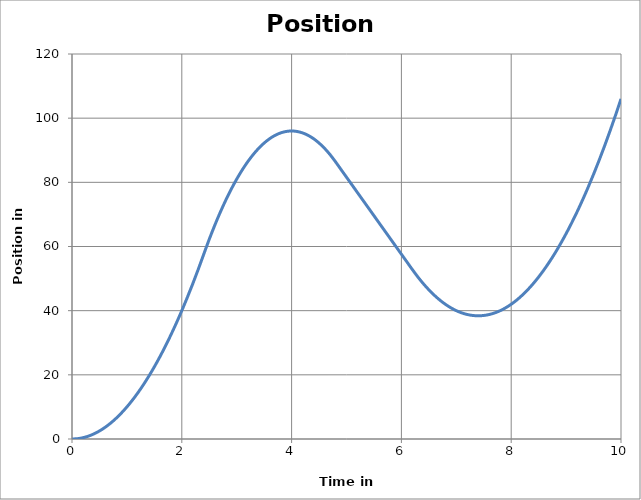
| Category | Position (m) |
|---|---|
| 0.0 | 0 |
| 0.1 | 0.1 |
| 0.2 | 0.4 |
| 0.30000000000000004 | 0.9 |
| 0.4 | 1.6 |
| 0.5 | 2.5 |
| 0.6 | 3.6 |
| 0.7 | 4.9 |
| 0.7999999999999999 | 6.4 |
| 0.8999999999999999 | 8.1 |
| 0.9999999999999999 | 10 |
| 1.0999999999999999 | 12.1 |
| 1.2 | 14.4 |
| 1.3 | 16.9 |
| 1.4000000000000001 | 19.6 |
| 1.5000000000000002 | 22.5 |
| 1.6000000000000003 | 25.6 |
| 1.7000000000000004 | 28.9 |
| 1.8000000000000005 | 32.4 |
| 1.9000000000000006 | 36.1 |
| 2.0000000000000004 | 40 |
| 2.1000000000000005 | 44.1 |
| 2.2000000000000006 | 48.4 |
| 2.3000000000000007 | 52.9 |
| 2.400000000000001 | 57.6 |
| 2.500000000000001 | 62.25 |
| 2.600000000000001 | 66.6 |
| 2.700000000000001 | 70.65 |
| 2.800000000000001 | 74.4 |
| 2.9000000000000012 | 77.85 |
| 3.0000000000000013 | 81 |
| 3.1000000000000014 | 83.85 |
| 3.2000000000000015 | 86.4 |
| 3.3000000000000016 | 88.65 |
| 3.4000000000000017 | 90.6 |
| 3.5000000000000018 | 92.25 |
| 3.600000000000002 | 93.6 |
| 3.700000000000002 | 94.65 |
| 3.800000000000002 | 95.4 |
| 3.900000000000002 | 95.85 |
| 4.000000000000002 | 96 |
| 4.100000000000001 | 95.85 |
| 4.200000000000001 | 95.4 |
| 4.300000000000001 | 94.65 |
| 4.4 | 93.6 |
| 4.5 | 92.25 |
| 4.6 | 90.6 |
| 4.699999999999999 | 88.65 |
| 4.799999999999999 | 86.4 |
| 4.899999999999999 | 84 |
| 4.999999999999998 | 81.6 |
| 5.099999999999998 | 79.2 |
| 5.1999999999999975 | 76.8 |
| 5.299999999999997 | 74.4 |
| 5.399999999999997 | 72 |
| 5.4999999999999964 | 69.6 |
| 5.599999999999996 | 67.2 |
| 5.699999999999996 | 64.8 |
| 5.799999999999995 | 62.4 |
| 5.899999999999995 | 60 |
| 5.999999999999995 | 57.6 |
| 6.099999999999994 | 55.2 |
| 6.199999999999994 | 52.8 |
| 6.299999999999994 | 50.5 |
| 6.399999999999993 | 48.4 |
| 6.499999999999993 | 46.5 |
| 6.5999999999999925 | 44.8 |
| 6.699999999999992 | 43.3 |
| 6.799999999999992 | 42 |
| 6.8999999999999915 | 40.9 |
| 6.999999999999991 | 40 |
| 7.099999999999991 | 39.3 |
| 7.19999999999999 | 38.8 |
| 7.29999999999999 | 38.5 |
| 7.39999999999999 | 38.4 |
| 7.499999999999989 | 38.5 |
| 7.599999999999989 | 38.8 |
| 7.699999999999989 | 39.3 |
| 7.799999999999988 | 40 |
| 7.899999999999988 | 40.9 |
| 7.999999999999988 | 42 |
| 8.099999999999987 | 43.3 |
| 8.199999999999987 | 44.8 |
| 8.299999999999986 | 46.5 |
| 8.399999999999986 | 48.4 |
| 8.499999999999986 | 50.5 |
| 8.599999999999985 | 52.8 |
| 8.699999999999985 | 55.3 |
| 8.799999999999985 | 58 |
| 8.899999999999984 | 60.9 |
| 8.999999999999984 | 64 |
| 9.099999999999984 | 67.3 |
| 9.199999999999983 | 70.8 |
| 9.299999999999983 | 74.5 |
| 9.399999999999983 | 78.4 |
| 9.499999999999982 | 82.5 |
| 9.599999999999982 | 86.8 |
| 9.699999999999982 | 91.3 |
| 9.799999999999981 | 96 |
| 9.89999999999998 | 100.9 |
| 9.99999999999998 | 106 |